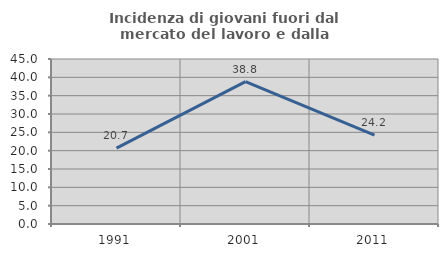
| Category | Incidenza di giovani fuori dal mercato del lavoro e dalla formazione  |
|---|---|
| 1991.0 | 20.715 |
| 2001.0 | 38.835 |
| 2011.0 | 24.22 |